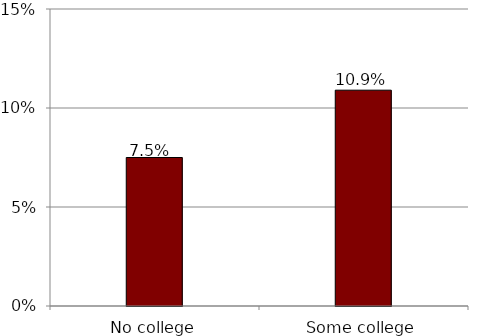
| Category | 7.5% |
|---|---|
| No college | 0.075 |
| Some college | 0.109 |